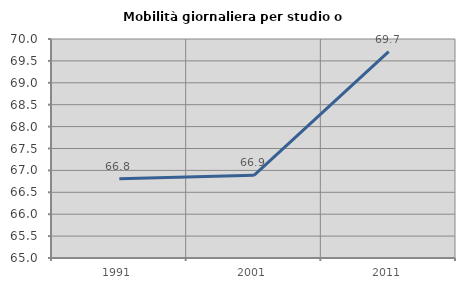
| Category | Mobilità giornaliera per studio o lavoro |
|---|---|
| 1991.0 | 66.808 |
| 2001.0 | 66.887 |
| 2011.0 | 69.713 |